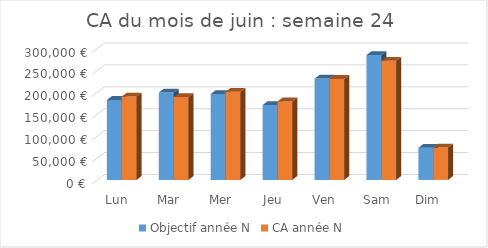
| Category | Objectif année N | CA année N |
|---|---|---|
| Lun | 182562 | 190386 |
| Mar | 199406 | 189068 |
| Mer | 196162 | 201192 |
| Jeu | 171002 | 179198 |
| Ven | 231311 | 230513 |
| Sam | 285075 | 272076 |
| Dim | 73395 | 73913 |